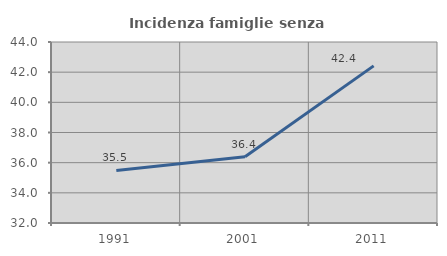
| Category | Incidenza famiglie senza nuclei |
|---|---|
| 1991.0 | 35.488 |
| 2001.0 | 36.388 |
| 2011.0 | 42.416 |